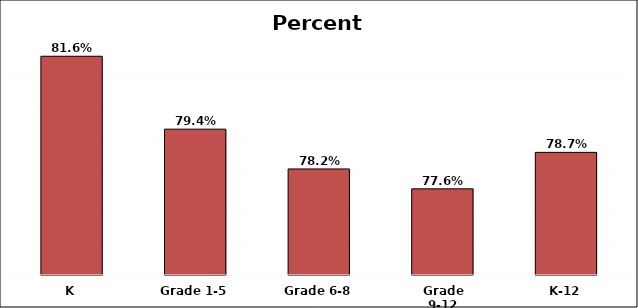
| Category | District* |
|---|---|
| K | 0.816 |
| Grade 1-5 | 0.794 |
| Grade 6-8 | 0.782 |
| Grade 9-12 | 0.776 |
| K-12 | 0.787 |